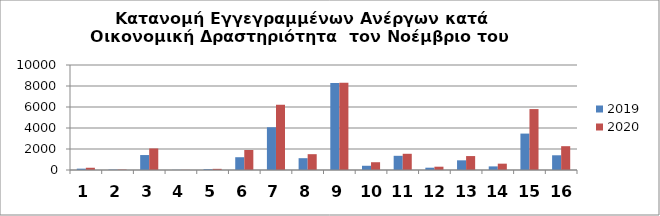
| Category | 2019 | 2020 |
|---|---|---|
| 0 | 128 | 214 |
| 1 | 37 | 41 |
| 2 | 1424 | 2053 |
| 3 | 13 | 14 |
| 4 | 78 | 110 |
| 5 | 1217 | 1907 |
| 6 | 4072 | 6214 |
| 7 | 1125 | 1507 |
| 8 | 8292 | 8311 |
| 9 | 403 | 740 |
| 10 | 1352 | 1544 |
| 11 | 219 | 314 |
| 12 | 922 | 1327 |
| 13 | 343 | 603 |
| 14 | 3468 | 5801 |
| 15 | 1402 | 2268 |